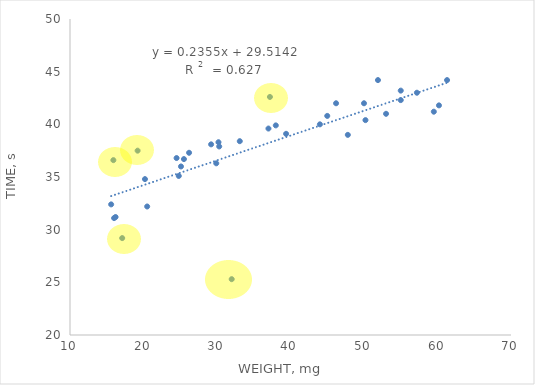
| Category | Time (s) |
|---|---|
| 15.6 | 32.4 |
| 15.9 | 36.6 |
| 16.0 | 31.1 |
| 16.2 | 31.2 |
| 17.1 | 29.2 |
| 19.2 | 37.5 |
| 20.2 | 34.8 |
| 20.5 | 32.2 |
| 24.5 | 36.8 |
| 24.8 | 35.1 |
| 25.1 | 36 |
| 25.5 | 36.7 |
| 26.2 | 37.3 |
| 29.2 | 38.1 |
| 29.9 | 36.3 |
| 30.2 | 38.3 |
| 30.3 | 37.9 |
| 32.0 | 25.3 |
| 33.1 | 38.4 |
| 37.0 | 39.6 |
| 37.2 | 42.6 |
| 38.0 | 39.9 |
| 39.4 | 39.1 |
| 44.0 | 40 |
| 45.0 | 40.8 |
| 46.2 | 42 |
| 47.8 | 39 |
| 50.0 | 42 |
| 50.2 | 40.4 |
| 51.9 | 44.2 |
| 53.0 | 41 |
| 55.0 | 43.2 |
| 55.0 | 42.3 |
| 57.2 | 43 |
| 59.5 | 41.2 |
| 60.2 | 41.8 |
| 61.3 | 44.2 |